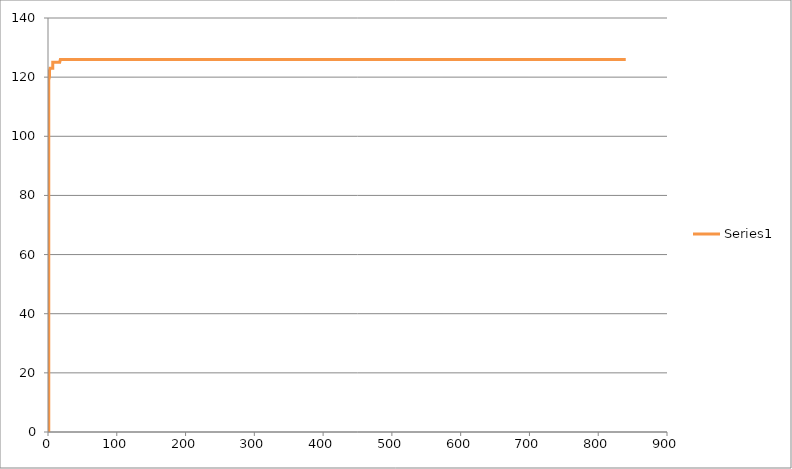
| Category | Series 0 |
|---|---|
| 1.0 | 0 |
| 1.0 | 1 |
| 1.0 | 2 |
| 1.0 | 3 |
| 1.0 | 4 |
| 1.0 | 5 |
| 1.0 | 6 |
| 1.0 | 7 |
| 1.0 | 8 |
| 1.0 | 9 |
| 1.0 | 10 |
| 1.0 | 11 |
| 1.0 | 12 |
| 1.0 | 13 |
| 1.0 | 14 |
| 1.0 | 15 |
| 1.0 | 16 |
| 1.0 | 17 |
| 1.0 | 18 |
| 1.0 | 19 |
| 1.0 | 20 |
| 1.0 | 21 |
| 1.0 | 22 |
| 1.0 | 23 |
| 1.0 | 24 |
| 1.0 | 25 |
| 1.0 | 26 |
| 1.0 | 27 |
| 1.0 | 28 |
| 1.0 | 29 |
| 1.0 | 30 |
| 1.0 | 31 |
| 1.0 | 32 |
| 1.0 | 33 |
| 1.0 | 34 |
| 1.0 | 35 |
| 1.0 | 36 |
| 1.0 | 37 |
| 1.0 | 38 |
| 1.0 | 39 |
| 1.0 | 40 |
| 1.0 | 41 |
| 1.0 | 42 |
| 1.0 | 43 |
| 1.0 | 44 |
| 1.0 | 45 |
| 1.0 | 46 |
| 1.0 | 47 |
| 1.0 | 48 |
| 1.0 | 49 |
| 1.0 | 50 |
| 1.0 | 51 |
| 1.0 | 52 |
| 1.0 | 53 |
| 1.0 | 54 |
| 1.0 | 55 |
| 1.0 | 56 |
| 1.0 | 57 |
| 1.0 | 58 |
| 1.0 | 59 |
| 1.0 | 60 |
| 1.0 | 61 |
| 1.0 | 62 |
| 1.0 | 63 |
| 1.0 | 64 |
| 1.0 | 65 |
| 1.0 | 66 |
| 1.0 | 67 |
| 1.0 | 68 |
| 1.0 | 69 |
| 1.0 | 70 |
| 1.0 | 71 |
| 1.0 | 72 |
| 1.0 | 73 |
| 1.0 | 74 |
| 1.0 | 75 |
| 1.0 | 76 |
| 1.0 | 77 |
| 1.0 | 78 |
| 1.0 | 79 |
| 1.0 | 80 |
| 1.0 | 81 |
| 1.0 | 82 |
| 1.0 | 83 |
| 1.0 | 84 |
| 1.0 | 85 |
| 1.0 | 86 |
| 1.0 | 87 |
| 1.0 | 88 |
| 1.0 | 89 |
| 1.0 | 90 |
| 1.0 | 91 |
| 1.0 | 92 |
| 1.0 | 93 |
| 1.0 | 94 |
| 1.0 | 95 |
| 1.0 | 96 |
| 1.0 | 97 |
| 1.0 | 98 |
| 1.0 | 99 |
| 1.0 | 100 |
| 1.0 | 101 |
| 1.0 | 102 |
| 1.0 | 103 |
| 1.0 | 104 |
| 1.0 | 105 |
| 1.0 | 106 |
| 1.0 | 107 |
| 1.0 | 108 |
| 1.0 | 109 |
| 1.0 | 110 |
| 1.0 | 111 |
| 1.0 | 112 |
| 1.0 | 113 |
| 1.0 | 114 |
| 1.0 | 115 |
| 1.0 | 116 |
| 1.0 | 117 |
| 1.0 | 118 |
| 1.0 | 119 |
| 2.0 | 119 |
| 2.0 | 120 |
| 2.0 | 121 |
| 2.0 | 122 |
| 3.0 | 122 |
| 3.0 | 123 |
| 4.0 | 123 |
| 5.0 | 123 |
| 6.0 | 123 |
| 7.0 | 123 |
| 7.0 | 124 |
| 7.0 | 125 |
| 8.0 | 125 |
| 9.0 | 125 |
| 10.0 | 125 |
| 11.0 | 125 |
| 12.0 | 125 |
| 13.0 | 125 |
| 14.0 | 125 |
| 15.0 | 125 |
| 16.0 | 125 |
| 17.0 | 125 |
| 18.0 | 125 |
| 18.0 | 126 |
| 19.0 | 126 |
| 20.0 | 126 |
| 21.0 | 126 |
| 22.0 | 126 |
| 23.0 | 126 |
| 24.0 | 126 |
| 25.0 | 126 |
| 26.0 | 126 |
| 27.0 | 126 |
| 28.0 | 126 |
| 29.0 | 126 |
| 30.0 | 126 |
| 31.0 | 126 |
| 32.0 | 126 |
| 33.0 | 126 |
| 34.0 | 126 |
| 35.0 | 126 |
| 36.0 | 126 |
| 37.0 | 126 |
| 38.0 | 126 |
| 39.0 | 126 |
| 40.0 | 126 |
| 41.0 | 126 |
| 42.0 | 126 |
| 43.0 | 126 |
| 44.0 | 126 |
| 45.0 | 126 |
| 46.0 | 126 |
| 47.0 | 126 |
| 48.0 | 126 |
| 49.0 | 126 |
| 50.0 | 126 |
| 51.0 | 126 |
| 52.0 | 126 |
| 53.0 | 126 |
| 54.0 | 126 |
| 55.0 | 126 |
| 56.0 | 126 |
| 57.0 | 126 |
| 58.0 | 126 |
| 59.0 | 126 |
| 60.0 | 126 |
| 61.0 | 126 |
| 62.0 | 126 |
| 63.0 | 126 |
| 64.0 | 126 |
| 65.0 | 126 |
| 66.0 | 126 |
| 67.0 | 126 |
| 68.0 | 126 |
| 69.0 | 126 |
| 70.0 | 126 |
| 71.0 | 126 |
| 72.0 | 126 |
| 73.0 | 126 |
| 74.0 | 126 |
| 75.0 | 126 |
| 76.0 | 126 |
| 77.0 | 126 |
| 78.0 | 126 |
| 79.0 | 126 |
| 80.0 | 126 |
| 81.0 | 126 |
| 82.0 | 126 |
| 83.0 | 126 |
| 84.0 | 126 |
| 85.0 | 126 |
| 86.0 | 126 |
| 87.0 | 126 |
| 88.0 | 126 |
| 89.0 | 126 |
| 90.0 | 126 |
| 91.0 | 126 |
| 92.0 | 126 |
| 93.0 | 126 |
| 94.0 | 126 |
| 95.0 | 126 |
| 96.0 | 126 |
| 97.0 | 126 |
| 98.0 | 126 |
| 99.0 | 126 |
| 100.0 | 126 |
| 101.0 | 126 |
| 102.0 | 126 |
| 103.0 | 126 |
| 104.0 | 126 |
| 105.0 | 126 |
| 106.0 | 126 |
| 107.0 | 126 |
| 108.0 | 126 |
| 109.0 | 126 |
| 110.0 | 126 |
| 111.0 | 126 |
| 112.0 | 126 |
| 113.0 | 126 |
| 114.0 | 126 |
| 115.0 | 126 |
| 116.0 | 126 |
| 117.0 | 126 |
| 118.0 | 126 |
| 119.0 | 126 |
| 120.0 | 126 |
| 121.0 | 126 |
| 122.0 | 126 |
| 123.0 | 126 |
| 124.0 | 126 |
| 125.0 | 126 |
| 126.0 | 126 |
| 127.0 | 126 |
| 128.0 | 126 |
| 129.0 | 126 |
| 130.0 | 126 |
| 131.0 | 126 |
| 132.0 | 126 |
| 133.0 | 126 |
| 134.0 | 126 |
| 135.0 | 126 |
| 136.0 | 126 |
| 137.0 | 126 |
| 138.0 | 126 |
| 139.0 | 126 |
| 140.0 | 126 |
| 141.0 | 126 |
| 142.0 | 126 |
| 143.0 | 126 |
| 144.0 | 126 |
| 145.0 | 126 |
| 146.0 | 126 |
| 147.0 | 126 |
| 148.0 | 126 |
| 149.0 | 126 |
| 150.0 | 126 |
| 151.0 | 126 |
| 152.0 | 126 |
| 153.0 | 126 |
| 154.0 | 126 |
| 155.0 | 126 |
| 156.0 | 126 |
| 157.0 | 126 |
| 158.0 | 126 |
| 159.0 | 126 |
| 160.0 | 126 |
| 161.0 | 126 |
| 162.0 | 126 |
| 163.0 | 126 |
| 164.0 | 126 |
| 165.0 | 126 |
| 166.0 | 126 |
| 167.0 | 126 |
| 168.0 | 126 |
| 169.0 | 126 |
| 170.0 | 126 |
| 171.0 | 126 |
| 172.0 | 126 |
| 173.0 | 126 |
| 174.0 | 126 |
| 175.0 | 126 |
| 176.0 | 126 |
| 177.0 | 126 |
| 178.0 | 126 |
| 179.0 | 126 |
| 180.0 | 126 |
| 181.0 | 126 |
| 182.0 | 126 |
| 183.0 | 126 |
| 184.0 | 126 |
| 185.0 | 126 |
| 186.0 | 126 |
| 187.0 | 126 |
| 188.0 | 126 |
| 189.0 | 126 |
| 190.0 | 126 |
| 191.0 | 126 |
| 192.0 | 126 |
| 193.0 | 126 |
| 194.0 | 126 |
| 195.0 | 126 |
| 196.0 | 126 |
| 197.0 | 126 |
| 198.0 | 126 |
| 199.0 | 126 |
| 200.0 | 126 |
| 201.0 | 126 |
| 202.0 | 126 |
| 203.0 | 126 |
| 204.0 | 126 |
| 205.0 | 126 |
| 206.0 | 126 |
| 207.0 | 126 |
| 208.0 | 126 |
| 209.0 | 126 |
| 210.0 | 126 |
| 211.0 | 126 |
| 212.0 | 126 |
| 213.0 | 126 |
| 214.0 | 126 |
| 215.0 | 126 |
| 216.0 | 126 |
| 217.0 | 126 |
| 218.0 | 126 |
| 219.0 | 126 |
| 220.0 | 126 |
| 221.0 | 126 |
| 222.0 | 126 |
| 223.0 | 126 |
| 224.0 | 126 |
| 225.0 | 126 |
| 226.0 | 126 |
| 227.0 | 126 |
| 228.0 | 126 |
| 229.0 | 126 |
| 230.0 | 126 |
| 231.0 | 126 |
| 232.0 | 126 |
| 233.0 | 126 |
| 234.0 | 126 |
| 235.0 | 126 |
| 236.0 | 126 |
| 237.0 | 126 |
| 238.0 | 126 |
| 239.0 | 126 |
| 240.0 | 126 |
| 241.0 | 126 |
| 242.0 | 126 |
| 243.0 | 126 |
| 244.0 | 126 |
| 245.0 | 126 |
| 246.0 | 126 |
| 247.0 | 126 |
| 248.0 | 126 |
| 249.0 | 126 |
| 250.0 | 126 |
| 251.0 | 126 |
| 252.0 | 126 |
| 253.0 | 126 |
| 254.0 | 126 |
| 255.0 | 126 |
| 256.0 | 126 |
| 257.0 | 126 |
| 258.0 | 126 |
| 259.0 | 126 |
| 260.0 | 126 |
| 261.0 | 126 |
| 262.0 | 126 |
| 263.0 | 126 |
| 264.0 | 126 |
| 265.0 | 126 |
| 266.0 | 126 |
| 267.0 | 126 |
| 268.0 | 126 |
| 269.0 | 126 |
| 270.0 | 126 |
| 271.0 | 126 |
| 272.0 | 126 |
| 273.0 | 126 |
| 274.0 | 126 |
| 275.0 | 126 |
| 276.0 | 126 |
| 277.0 | 126 |
| 278.0 | 126 |
| 279.0 | 126 |
| 280.0 | 126 |
| 281.0 | 126 |
| 282.0 | 126 |
| 283.0 | 126 |
| 284.0 | 126 |
| 285.0 | 126 |
| 286.0 | 126 |
| 287.0 | 126 |
| 288.0 | 126 |
| 289.0 | 126 |
| 290.0 | 126 |
| 291.0 | 126 |
| 292.0 | 126 |
| 293.0 | 126 |
| 294.0 | 126 |
| 295.0 | 126 |
| 296.0 | 126 |
| 297.0 | 126 |
| 298.0 | 126 |
| 299.0 | 126 |
| 300.0 | 126 |
| 301.0 | 126 |
| 302.0 | 126 |
| 303.0 | 126 |
| 304.0 | 126 |
| 305.0 | 126 |
| 306.0 | 126 |
| 307.0 | 126 |
| 308.0 | 126 |
| 309.0 | 126 |
| 310.0 | 126 |
| 311.0 | 126 |
| 312.0 | 126 |
| 313.0 | 126 |
| 314.0 | 126 |
| 315.0 | 126 |
| 316.0 | 126 |
| 317.0 | 126 |
| 318.0 | 126 |
| 319.0 | 126 |
| 320.0 | 126 |
| 321.0 | 126 |
| 322.0 | 126 |
| 323.0 | 126 |
| 324.0 | 126 |
| 325.0 | 126 |
| 326.0 | 126 |
| 327.0 | 126 |
| 328.0 | 126 |
| 329.0 | 126 |
| 330.0 | 126 |
| 331.0 | 126 |
| 332.0 | 126 |
| 333.0 | 126 |
| 334.0 | 126 |
| 335.0 | 126 |
| 336.0 | 126 |
| 337.0 | 126 |
| 338.0 | 126 |
| 339.0 | 126 |
| 340.0 | 126 |
| 341.0 | 126 |
| 342.0 | 126 |
| 343.0 | 126 |
| 344.0 | 126 |
| 345.0 | 126 |
| 346.0 | 126 |
| 347.0 | 126 |
| 348.0 | 126 |
| 349.0 | 126 |
| 350.0 | 126 |
| 351.0 | 126 |
| 352.0 | 126 |
| 353.0 | 126 |
| 354.0 | 126 |
| 355.0 | 126 |
| 356.0 | 126 |
| 357.0 | 126 |
| 358.0 | 126 |
| 359.0 | 126 |
| 360.0 | 126 |
| 361.0 | 126 |
| 362.0 | 126 |
| 363.0 | 126 |
| 364.0 | 126 |
| 365.0 | 126 |
| 366.0 | 126 |
| 367.0 | 126 |
| 368.0 | 126 |
| 369.0 | 126 |
| 370.0 | 126 |
| 371.0 | 126 |
| 372.0 | 126 |
| 373.0 | 126 |
| 374.0 | 126 |
| 375.0 | 126 |
| 376.0 | 126 |
| 377.0 | 126 |
| 378.0 | 126 |
| 379.0 | 126 |
| 380.0 | 126 |
| 381.0 | 126 |
| 382.0 | 126 |
| 383.0 | 126 |
| 384.0 | 126 |
| 385.0 | 126 |
| 386.0 | 126 |
| 387.0 | 126 |
| 388.0 | 126 |
| 389.0 | 126 |
| 390.0 | 126 |
| 391.0 | 126 |
| 392.0 | 126 |
| 393.0 | 126 |
| 394.0 | 126 |
| 395.0 | 126 |
| 396.0 | 126 |
| 397.0 | 126 |
| 398.0 | 126 |
| 399.0 | 126 |
| 400.0 | 126 |
| 401.0 | 126 |
| 402.0 | 126 |
| 403.0 | 126 |
| 404.0 | 126 |
| 405.0 | 126 |
| 406.0 | 126 |
| 407.0 | 126 |
| 408.0 | 126 |
| 409.0 | 126 |
| 410.0 | 126 |
| 411.0 | 126 |
| 412.0 | 126 |
| 413.0 | 126 |
| 414.0 | 126 |
| 415.0 | 126 |
| 416.0 | 126 |
| 417.0 | 126 |
| 418.0 | 126 |
| 419.0 | 126 |
| 420.0 | 126 |
| 421.0 | 126 |
| 422.0 | 126 |
| 423.0 | 126 |
| 424.0 | 126 |
| 425.0 | 126 |
| 426.0 | 126 |
| 427.0 | 126 |
| 428.0 | 126 |
| 429.0 | 126 |
| 430.0 | 126 |
| 431.0 | 126 |
| 432.0 | 126 |
| 433.0 | 126 |
| 434.0 | 126 |
| 435.0 | 126 |
| 436.0 | 126 |
| 437.0 | 126 |
| 438.0 | 126 |
| 439.0 | 126 |
| 440.0 | 126 |
| 441.0 | 126 |
| 442.0 | 126 |
| 443.0 | 126 |
| 444.0 | 126 |
| 445.0 | 126 |
| 446.0 | 126 |
| 447.0 | 126 |
| 448.0 | 126 |
| 449.0 | 126 |
| 450.0 | 126 |
| 451.0 | 126 |
| 452.0 | 126 |
| 453.0 | 126 |
| 454.0 | 126 |
| 455.0 | 126 |
| 456.0 | 126 |
| 457.0 | 126 |
| 458.0 | 126 |
| 459.0 | 126 |
| 460.0 | 126 |
| 461.0 | 126 |
| 462.0 | 126 |
| 463.0 | 126 |
| 464.0 | 126 |
| 465.0 | 126 |
| 466.0 | 126 |
| 467.0 | 126 |
| 468.0 | 126 |
| 469.0 | 126 |
| 470.0 | 126 |
| 471.0 | 126 |
| 472.0 | 126 |
| 473.0 | 126 |
| 474.0 | 126 |
| 475.0 | 126 |
| 476.0 | 126 |
| 477.0 | 126 |
| 478.0 | 126 |
| 479.0 | 126 |
| 480.0 | 126 |
| 481.0 | 126 |
| 482.0 | 126 |
| 483.0 | 126 |
| 484.0 | 126 |
| 485.0 | 126 |
| 486.0 | 126 |
| 487.0 | 126 |
| 488.0 | 126 |
| 489.0 | 126 |
| 490.0 | 126 |
| 491.0 | 126 |
| 492.0 | 126 |
| 493.0 | 126 |
| 494.0 | 126 |
| 495.0 | 126 |
| 496.0 | 126 |
| 497.0 | 126 |
| 498.0 | 126 |
| 499.0 | 126 |
| 500.0 | 126 |
| 501.0 | 126 |
| 502.0 | 126 |
| 503.0 | 126 |
| 504.0 | 126 |
| 505.0 | 126 |
| 506.0 | 126 |
| 507.0 | 126 |
| 508.0 | 126 |
| 509.0 | 126 |
| 510.0 | 126 |
| 511.0 | 126 |
| 512.0 | 126 |
| 513.0 | 126 |
| 514.0 | 126 |
| 515.0 | 126 |
| 516.0 | 126 |
| 517.0 | 126 |
| 518.0 | 126 |
| 519.0 | 126 |
| 520.0 | 126 |
| 521.0 | 126 |
| 522.0 | 126 |
| 523.0 | 126 |
| 524.0 | 126 |
| 525.0 | 126 |
| 526.0 | 126 |
| 527.0 | 126 |
| 528.0 | 126 |
| 529.0 | 126 |
| 530.0 | 126 |
| 531.0 | 126 |
| 532.0 | 126 |
| 533.0 | 126 |
| 534.0 | 126 |
| 535.0 | 126 |
| 536.0 | 126 |
| 537.0 | 126 |
| 538.0 | 126 |
| 539.0 | 126 |
| 540.0 | 126 |
| 541.0 | 126 |
| 542.0 | 126 |
| 543.0 | 126 |
| 544.0 | 126 |
| 545.0 | 126 |
| 546.0 | 126 |
| 547.0 | 126 |
| 548.0 | 126 |
| 549.0 | 126 |
| 550.0 | 126 |
| 551.0 | 126 |
| 552.0 | 126 |
| 553.0 | 126 |
| 554.0 | 126 |
| 555.0 | 126 |
| 556.0 | 126 |
| 557.0 | 126 |
| 558.0 | 126 |
| 559.0 | 126 |
| 560.0 | 126 |
| 561.0 | 126 |
| 562.0 | 126 |
| 563.0 | 126 |
| 564.0 | 126 |
| 565.0 | 126 |
| 566.0 | 126 |
| 567.0 | 126 |
| 568.0 | 126 |
| 569.0 | 126 |
| 570.0 | 126 |
| 571.0 | 126 |
| 572.0 | 126 |
| 573.0 | 126 |
| 574.0 | 126 |
| 575.0 | 126 |
| 576.0 | 126 |
| 577.0 | 126 |
| 578.0 | 126 |
| 579.0 | 126 |
| 580.0 | 126 |
| 581.0 | 126 |
| 582.0 | 126 |
| 583.0 | 126 |
| 584.0 | 126 |
| 585.0 | 126 |
| 586.0 | 126 |
| 587.0 | 126 |
| 588.0 | 126 |
| 589.0 | 126 |
| 590.0 | 126 |
| 591.0 | 126 |
| 592.0 | 126 |
| 593.0 | 126 |
| 594.0 | 126 |
| 595.0 | 126 |
| 596.0 | 126 |
| 597.0 | 126 |
| 598.0 | 126 |
| 599.0 | 126 |
| 600.0 | 126 |
| 601.0 | 126 |
| 602.0 | 126 |
| 603.0 | 126 |
| 604.0 | 126 |
| 605.0 | 126 |
| 606.0 | 126 |
| 607.0 | 126 |
| 608.0 | 126 |
| 609.0 | 126 |
| 610.0 | 126 |
| 611.0 | 126 |
| 612.0 | 126 |
| 613.0 | 126 |
| 614.0 | 126 |
| 615.0 | 126 |
| 616.0 | 126 |
| 617.0 | 126 |
| 618.0 | 126 |
| 619.0 | 126 |
| 620.0 | 126 |
| 621.0 | 126 |
| 622.0 | 126 |
| 623.0 | 126 |
| 624.0 | 126 |
| 625.0 | 126 |
| 626.0 | 126 |
| 627.0 | 126 |
| 628.0 | 126 |
| 629.0 | 126 |
| 630.0 | 126 |
| 631.0 | 126 |
| 632.0 | 126 |
| 633.0 | 126 |
| 634.0 | 126 |
| 635.0 | 126 |
| 636.0 | 126 |
| 637.0 | 126 |
| 638.0 | 126 |
| 639.0 | 126 |
| 640.0 | 126 |
| 641.0 | 126 |
| 642.0 | 126 |
| 643.0 | 126 |
| 644.0 | 126 |
| 645.0 | 126 |
| 646.0 | 126 |
| 647.0 | 126 |
| 648.0 | 126 |
| 649.0 | 126 |
| 650.0 | 126 |
| 651.0 | 126 |
| 652.0 | 126 |
| 653.0 | 126 |
| 654.0 | 126 |
| 655.0 | 126 |
| 656.0 | 126 |
| 657.0 | 126 |
| 658.0 | 126 |
| 659.0 | 126 |
| 660.0 | 126 |
| 661.0 | 126 |
| 662.0 | 126 |
| 663.0 | 126 |
| 664.0 | 126 |
| 665.0 | 126 |
| 666.0 | 126 |
| 667.0 | 126 |
| 668.0 | 126 |
| 669.0 | 126 |
| 670.0 | 126 |
| 671.0 | 126 |
| 672.0 | 126 |
| 673.0 | 126 |
| 674.0 | 126 |
| 675.0 | 126 |
| 676.0 | 126 |
| 677.0 | 126 |
| 678.0 | 126 |
| 679.0 | 126 |
| 680.0 | 126 |
| 681.0 | 126 |
| 682.0 | 126 |
| 683.0 | 126 |
| 684.0 | 126 |
| 685.0 | 126 |
| 686.0 | 126 |
| 687.0 | 126 |
| 688.0 | 126 |
| 689.0 | 126 |
| 690.0 | 126 |
| 691.0 | 126 |
| 692.0 | 126 |
| 693.0 | 126 |
| 694.0 | 126 |
| 695.0 | 126 |
| 696.0 | 126 |
| 697.0 | 126 |
| 698.0 | 126 |
| 699.0 | 126 |
| 700.0 | 126 |
| 701.0 | 126 |
| 702.0 | 126 |
| 703.0 | 126 |
| 704.0 | 126 |
| 705.0 | 126 |
| 706.0 | 126 |
| 707.0 | 126 |
| 708.0 | 126 |
| 709.0 | 126 |
| 710.0 | 126 |
| 711.0 | 126 |
| 712.0 | 126 |
| 713.0 | 126 |
| 714.0 | 126 |
| 715.0 | 126 |
| 716.0 | 126 |
| 717.0 | 126 |
| 718.0 | 126 |
| 719.0 | 126 |
| 720.0 | 126 |
| 721.0 | 126 |
| 722.0 | 126 |
| 723.0 | 126 |
| 724.0 | 126 |
| 725.0 | 126 |
| 726.0 | 126 |
| 727.0 | 126 |
| 728.0 | 126 |
| 729.0 | 126 |
| 730.0 | 126 |
| 731.0 | 126 |
| 732.0 | 126 |
| 733.0 | 126 |
| 734.0 | 126 |
| 735.0 | 126 |
| 736.0 | 126 |
| 737.0 | 126 |
| 738.0 | 126 |
| 739.0 | 126 |
| 740.0 | 126 |
| 741.0 | 126 |
| 742.0 | 126 |
| 743.0 | 126 |
| 744.0 | 126 |
| 745.0 | 126 |
| 746.0 | 126 |
| 747.0 | 126 |
| 748.0 | 126 |
| 749.0 | 126 |
| 750.0 | 126 |
| 751.0 | 126 |
| 752.0 | 126 |
| 753.0 | 126 |
| 754.0 | 126 |
| 755.0 | 126 |
| 756.0 | 126 |
| 757.0 | 126 |
| 758.0 | 126 |
| 759.0 | 126 |
| 760.0 | 126 |
| 761.0 | 126 |
| 762.0 | 126 |
| 763.0 | 126 |
| 764.0 | 126 |
| 765.0 | 126 |
| 766.0 | 126 |
| 767.0 | 126 |
| 768.0 | 126 |
| 769.0 | 126 |
| 770.0 | 126 |
| 771.0 | 126 |
| 772.0 | 126 |
| 773.0 | 126 |
| 774.0 | 126 |
| 775.0 | 126 |
| 776.0 | 126 |
| 777.0 | 126 |
| 778.0 | 126 |
| 779.0 | 126 |
| 780.0 | 126 |
| 781.0 | 126 |
| 782.0 | 126 |
| 783.0 | 126 |
| 784.0 | 126 |
| 785.0 | 126 |
| 786.0 | 126 |
| 787.0 | 126 |
| 788.0 | 126 |
| 789.0 | 126 |
| 790.0 | 126 |
| 791.0 | 126 |
| 792.0 | 126 |
| 793.0 | 126 |
| 794.0 | 126 |
| 795.0 | 126 |
| 796.0 | 126 |
| 797.0 | 126 |
| 798.0 | 126 |
| 799.0 | 126 |
| 800.0 | 126 |
| 801.0 | 126 |
| 802.0 | 126 |
| 803.0 | 126 |
| 804.0 | 126 |
| 805.0 | 126 |
| 806.0 | 126 |
| 807.0 | 126 |
| 808.0 | 126 |
| 809.0 | 126 |
| 810.0 | 126 |
| 811.0 | 126 |
| 812.0 | 126 |
| 813.0 | 126 |
| 814.0 | 126 |
| 815.0 | 126 |
| 816.0 | 126 |
| 817.0 | 126 |
| 818.0 | 126 |
| 819.0 | 126 |
| 820.0 | 126 |
| 821.0 | 126 |
| 822.0 | 126 |
| 823.0 | 126 |
| 824.0 | 126 |
| 825.0 | 126 |
| 826.0 | 126 |
| 827.0 | 126 |
| 828.0 | 126 |
| 829.0 | 126 |
| 830.0 | 126 |
| 831.0 | 126 |
| 832.0 | 126 |
| 833.0 | 126 |
| 834.0 | 126 |
| 835.0 | 126 |
| 836.0 | 126 |
| 837.0 | 126 |
| 838.0 | 126 |
| 839.0 | 126 |
| 840.0 | 126 |